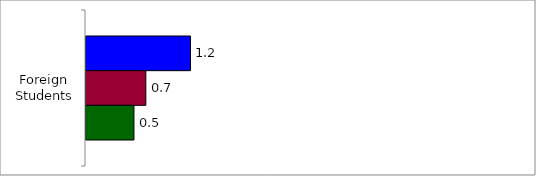
| Category | 50 States and D.C. | SREB States | State |
|---|---|---|---|
| Foreign Students | 1.185 | 0.678 | 0.544 |